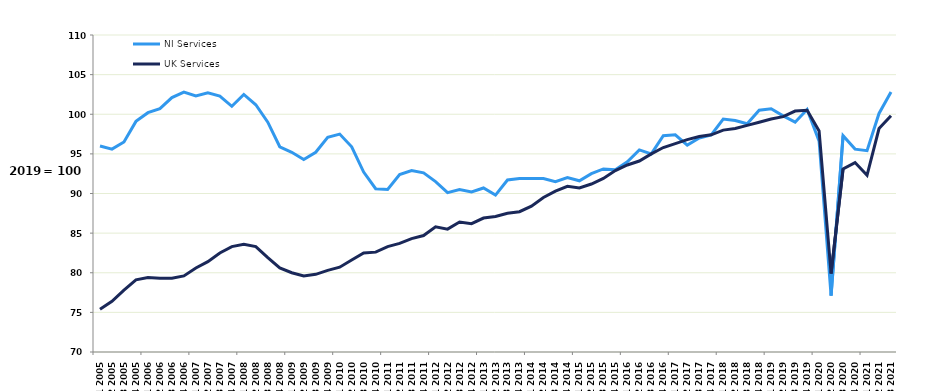
| Category | NI Services | UK Services |
|---|---|---|
| Q1 2005 | 96 | 75.4 |
| Q2 2005 | 95.6 | 76.4 |
| Q3 2005 | 96.5 | 77.8 |
| Q4 2005 | 99.1 | 79.1 |
| Q1 2006 | 100.2 | 79.4 |
| Q2 2006 | 100.7 | 79.3 |
| Q3 2006 | 102.1 | 79.3 |
| Q4 2006 | 102.8 | 79.6 |
| Q1 2007 | 102.3 | 80.6 |
| Q2 2007 | 102.7 | 81.4 |
| Q3 2007 | 102.3 | 82.5 |
| Q4 2007 | 101 | 83.3 |
| Q1 2008 | 102.5 | 83.6 |
| Q2 2008 | 101.2 | 83.3 |
| Q3 2008 | 99 | 81.9 |
| Q4 2008 | 95.9 | 80.6 |
| Q1 2009 | 95.2 | 80 |
| Q2 2009 | 94.3 | 79.6 |
| Q3 2009 | 95.2 | 79.8 |
| Q4 2009 | 97.1 | 80.3 |
| Q1 2010 | 97.5 | 80.7 |
| Q2 2010 | 95.9 | 81.6 |
| Q3 2010 | 92.7 | 82.5 |
| Q4 2010 | 90.6 | 82.6 |
| Q1 2011 | 90.5 | 83.3 |
| Q2 2011 | 92.4 | 83.7 |
| Q3 2011 | 92.9 | 84.3 |
| Q4 2011 | 92.6 | 84.7 |
| Q1 2012 | 91.5 | 85.8 |
| Q2 2012 | 90.1 | 85.5 |
| Q3 2012 | 90.5 | 86.4 |
| Q4 2012 | 90.2 | 86.2 |
| Q1 2013 | 90.7 | 86.9 |
| Q2 2013 | 89.8 | 87.1 |
| Q3 2013 | 91.7 | 87.5 |
| Q4 2013 | 91.9 | 87.7 |
| Q1 2014 | 91.9 | 88.4 |
| Q2 2014 | 91.9 | 89.5 |
| Q3 2014 | 91.5 | 90.3 |
| Q4 2014 | 92 | 90.9 |
| Q1 2015 | 91.6 | 90.7 |
| Q2 2015 | 92.5 | 91.2 |
| Q3 2015 | 93.1 | 91.9 |
| Q4 2015 | 93 | 92.9 |
| Q1 2016 | 94 | 93.6 |
| Q2 2016 | 95.5 | 94.1 |
| Q3 2016 | 95 | 95 |
| Q4 2016 | 97.3 | 95.8 |
| Q1 2017 | 97.4 | 96.3 |
| Q2 2017 | 96.1 | 96.8 |
| Q3 2017 | 97 | 97.2 |
| Q4 2017 | 97.4 | 97.4 |
| Q1 2018 | 99.4 | 98 |
| Q2 2018 | 99.2 | 98.2 |
| Q3 2018 | 98.8 | 98.6 |
| Q4 2018 | 100.5 | 99 |
| Q1 2019 | 100.7 | 99.4 |
| Q2 2019 | 99.8 | 99.7 |
| Q3 2019 | 99 | 100.4 |
| Q4 2019 | 100.6 | 100.5 |
| Q1 2020 | 96.6 | 97.9 |
| Q2 2020 | 77.1 | 79.9 |
| Q3 2020 | 97.3 | 93.1 |
| Q4 2020 | 95.6 | 93.9 |
| Q1 2021 | 95.4 | 92.3 |
| Q2 2021 | 100.1 | 98.2 |
| Q3 2021 | 102.8 | 99.8 |